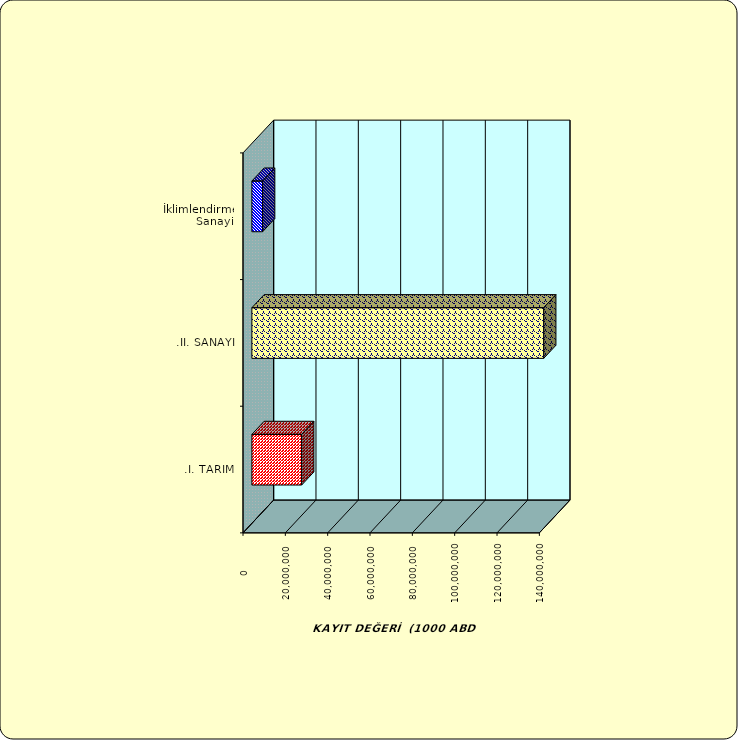
| Category | Series 0 |
|---|---|
| .I. TARIM | 23511606.459 |
| .II. SANAYİ | 137855650.143 |
|  İklimlendirme Sanayii | 5065214.206 |